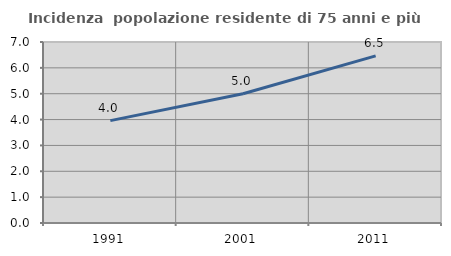
| Category | Incidenza  popolazione residente di 75 anni e più |
|---|---|
| 1991.0 | 3.959 |
| 2001.0 | 4.997 |
| 2011.0 | 6.464 |